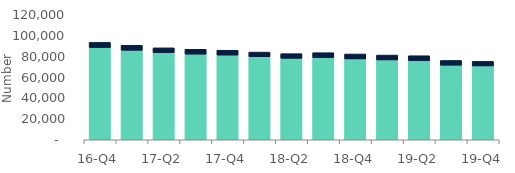
| Category | Homeowners | Buy-to-let |
|---|---|---|
| 16-Q4 | 88550 | 4930 |
| 17-Q1 | 85930 | 4810 |
| 17-Q2 | 83560 | 4700 |
| 17-Q3 | 82200 | 4690 |
| 17-Q4 | 81290 | 4670 |
| 18-Q1 | 79670 | 4500 |
| 18-Q2 | 78240 | 4440 |
| 18-Q3 | 78820 | 4770 |
| 18-Q4 | 77620 | 4720 |
| 19-Q1 | 76640 | 4680 |
| 19-Q2 | 75960 | 4720 |
| 19-Q3 | 71590 | 4550 |
| 19-Q4 | 70880 | 4390 |